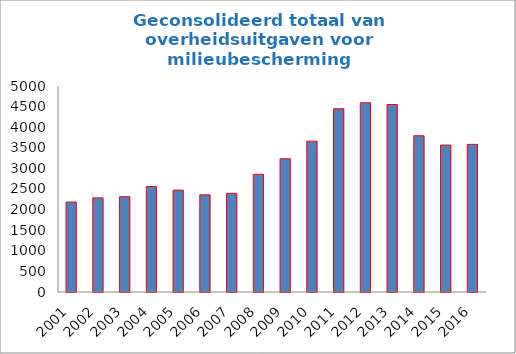
| Category | Geconsolideerd totaal (a) |
|---|---|
| 2001.0 | 2183.7 |
| 2002.0 | 2284.9 |
| 2003.0 | 2314.4 |
| 2004.0 | 2559.3 |
| 2005.0 | 2472.7 |
| 2006.0 | 2358.4 |
| 2007.0 | 2393.8 |
| 2008.0 | 2858.3 |
| 2009.0 | 3234.6 |
| 2010.0 | 3660.8 |
| 2011.0 | 4448.4 |
| 2012.0 | 4594.2 |
| 2013.0 | 4549.9 |
| 2014.0 | 3792.9 |
| 2015.0 | 3566.5 |
| 2016.0 | 3583.3 |